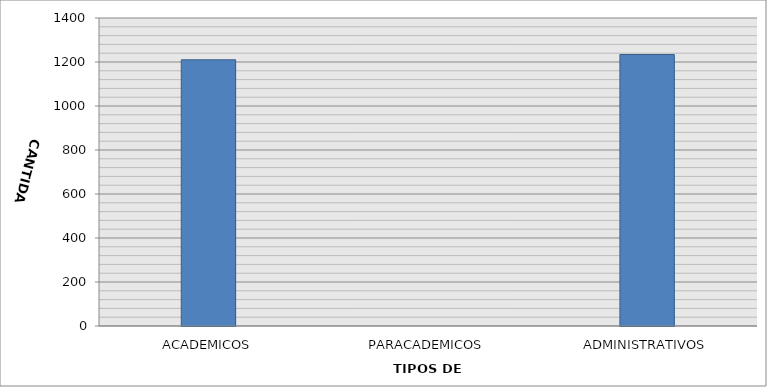
| Category | CANTIDAD |
|---|---|
| ACADEMICOS | 1210 |
| PARACADEMICOS | 0 |
| ADMINISTRATIVOS | 1234 |